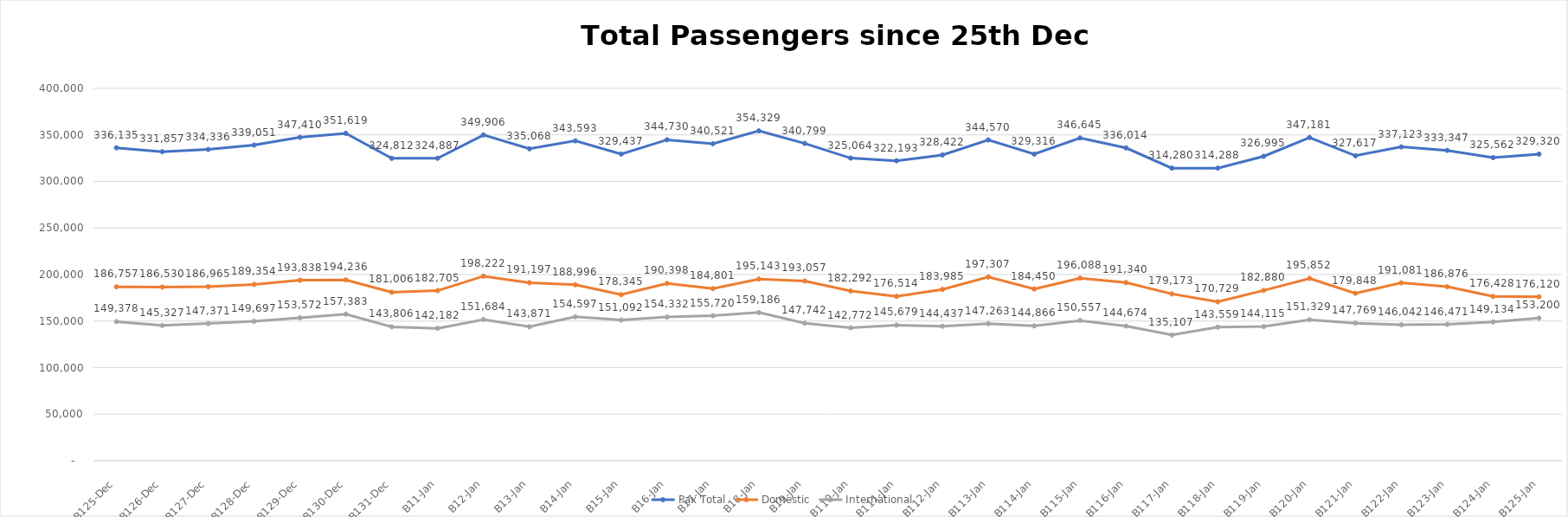
| Category | Pax Total |  Domestic  |  International  |
|---|---|---|---|
| 2022-12-25 | 336135 | 186757 | 149378 |
| 2022-12-26 | 331857 | 186530 | 145327 |
| 2022-12-27 | 334336 | 186965 | 147371 |
| 2022-12-28 | 339051 | 189354 | 149697 |
| 2022-12-29 | 347410 | 193838 | 153572 |
| 2022-12-30 | 351619 | 194236 | 157383 |
| 2022-12-31 | 324812 | 181006 | 143806 |
| 2023-01-01 | 324887 | 182705 | 142182 |
| 2023-01-02 | 349906 | 198222 | 151684 |
| 2023-01-03 | 335068 | 191197 | 143871 |
| 2023-01-04 | 343593 | 188996 | 154597 |
| 2023-01-05 | 329437 | 178345 | 151092 |
| 2023-01-06 | 344730 | 190398 | 154332 |
| 2023-01-07 | 340521 | 184801 | 155720 |
| 2023-01-08 | 354329 | 195143 | 159186 |
| 2023-01-09 | 340799 | 193057 | 147742 |
| 2023-01-10 | 325064 | 182292 | 142772 |
| 2023-01-11 | 322193 | 176514 | 145679 |
| 2023-01-12 | 328422 | 183985 | 144437 |
| 2023-01-13 | 344570 | 197307 | 147263 |
| 2023-01-14 | 329316 | 184450 | 144866 |
| 2023-01-15 | 346645 | 196088 | 150557 |
| 2023-01-16 | 336014 | 191340 | 144674 |
| 2023-01-17 | 314280 | 179173 | 135107 |
| 2023-01-18 | 314288 | 170729 | 143559 |
| 2023-01-19 | 326995 | 182880 | 144115 |
| 2023-01-20 | 347181 | 195852 | 151329 |
| 2023-01-21 | 327617 | 179848 | 147769 |
| 2023-01-22 | 337123 | 191081 | 146042 |
| 2023-01-23 | 333347 | 186876 | 146471 |
| 2023-01-24 | 325562 | 176428 | 149134 |
| 2023-01-25 | 329320 | 176120 | 153200 |